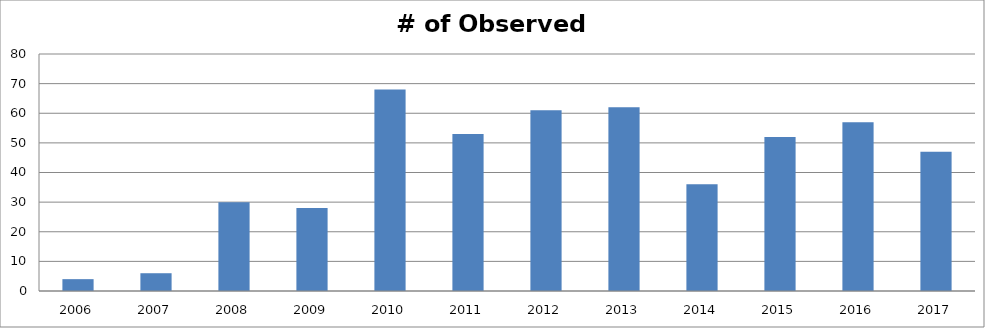
| Category | # of Observed Stands |
|---|---|
| 2006.0 | 4 |
| 2007.0 | 6 |
| 2008.0 | 30 |
| 2009.0 | 28 |
| 2010.0 | 68 |
| 2011.0 | 53 |
| 2012.0 | 61 |
| 2013.0 | 62 |
| 2014.0 | 36 |
| 2015.0 | 52 |
| 2016.0 | 57 |
| 2017.0 | 47 |